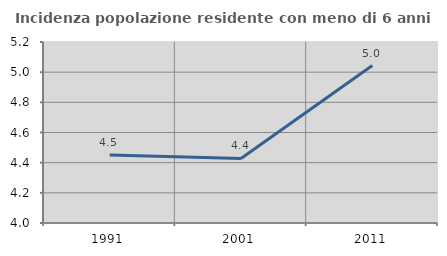
| Category | Incidenza popolazione residente con meno di 6 anni |
|---|---|
| 1991.0 | 4.45 |
| 2001.0 | 4.428 |
| 2011.0 | 5.044 |